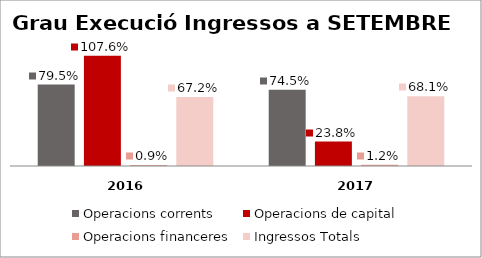
| Category | Operacions corrents | Operacions de capital | Operacions financeres | Ingressos Totals |
|---|---|---|---|---|
| 0 | 0.795 | 1.076 | 0.009 | 0.672 |
| 1 | 0.745 | 0.238 | 0.012 | 0.681 |